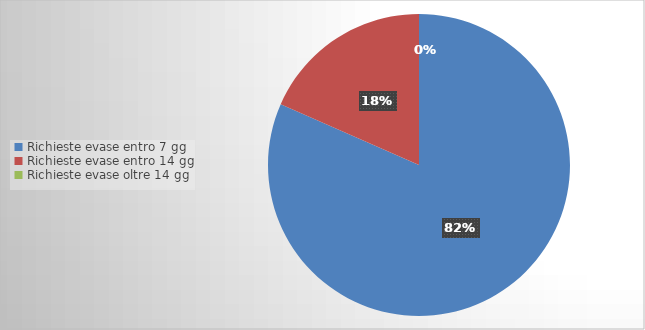
| Category | Series 0 |
|---|---|
| Richieste evase entro 7 gg | 31 |
| Richieste evase entro 14 gg | 7 |
| Richieste evase oltre 14 gg | 0 |